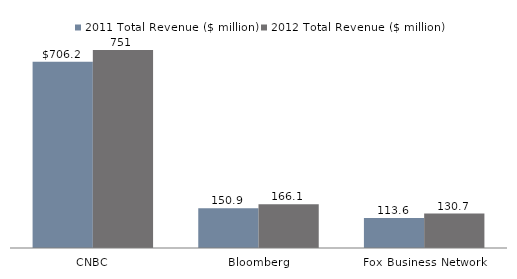
| Category | 2011 Total Revenue ($ million) | 2012 Total Revenue ($ million) |
|---|---|---|
| CNBC | 706.2 | 751 |
| Bloomberg | 150.9 | 166.1 |
| Fox Business Network | 113.6 | 130.7 |